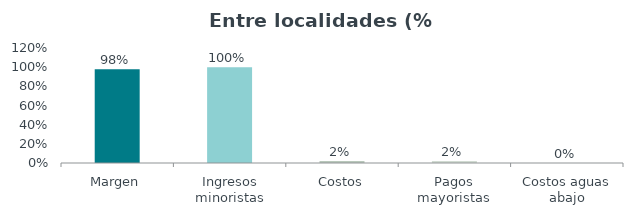
| Category | Series 0 |
|---|---|
| Margen | 0.978 |
| Ingresos minoristas | 1 |
| Costos | 0.022 |
| Pagos mayoristas | 0.022 |
| Costos aguas abajo | 0 |